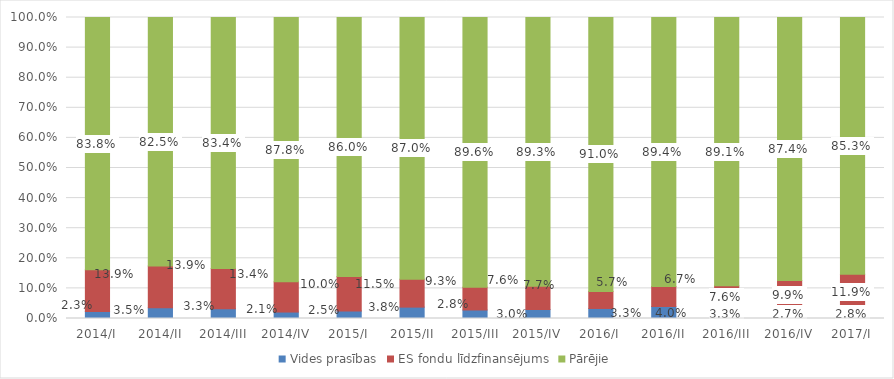
| Category | Vides prasības | ES fondu līdzfinansējums | Pārējie |
|---|---|---|---|
| 2014/I | 0.023 | 0.139 | 0.838 |
| 2014/II | 0.035 | 0.139 | 0.825 |
| 2014/III | 0.033 | 0.134 | 0.834 |
| 2014/IV | 0.021 | 0.1 | 0.878 |
| 2015/I | 0.025 | 0.115 | 0.86 |
| 2015/II | 0.038 | 0.093 | 0.87 |
| 2015/III | 0.028 | 0.076 | 0.896 |
| 2015/IV | 0.03 | 0.077 | 0.893 |
| 2016/I | 0.033 | 0.057 | 0.91 |
| 2016/II | 0.04 | 0.067 | 0.894 |
| 2016/III | 0.033 | 0.076 | 0.891 |
| 2016/IV | 0.027 | 0.099 | 0.874 |
| 2017/I | 0.028 | 0.119 | 0.853 |